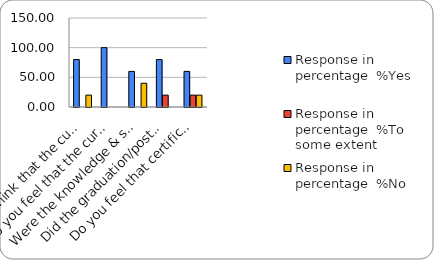
| Category | Response in percentage  |
|---|---|
| Do you think that the curriculum which you had during your graduation/post graduation has provided you with the knowledge & skills necessary to get employed/Self-employed or start own business? | 20 |
| Do you feel that the curriculum you studied is helpful in progression to higher studies? | 0 |
| Were the knowledge & skills acquired through the curriculum useful to you while working on the job?   | 40 |
| Did the graduation/post-graduation programme bring about any attitudinal and behavioural change in you? | 0 |
| Do you feel that certificate/ diploma courses offered by the college in addition to the curriculum lead to better career prospects? | 20 |